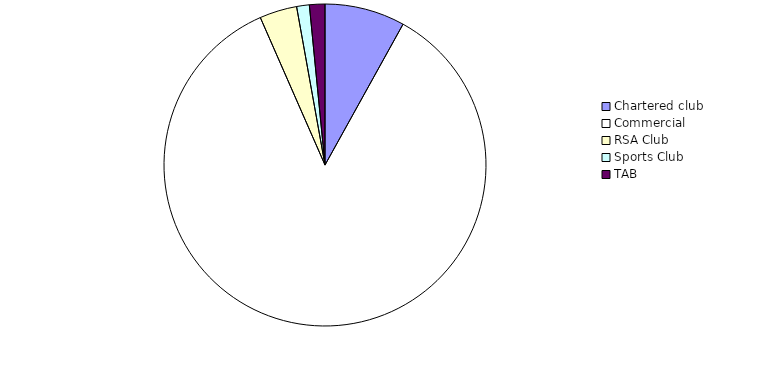
| Category | Series 0 |
|---|---|
| Chartered club | 17820955.56 |
| Commercial | 188861630.67 |
| RSA Club  | 8302827.68 |
| Sports Club | 2813176.78 |
| TAB | 3439234.33 |